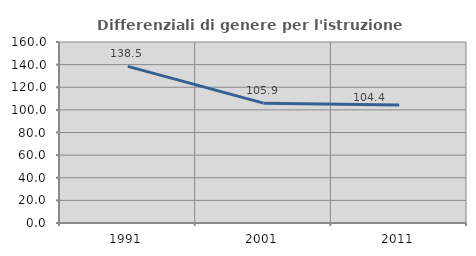
| Category | Differenziali di genere per l'istruzione superiore |
|---|---|
| 1991.0 | 138.479 |
| 2001.0 | 105.926 |
| 2011.0 | 104.411 |